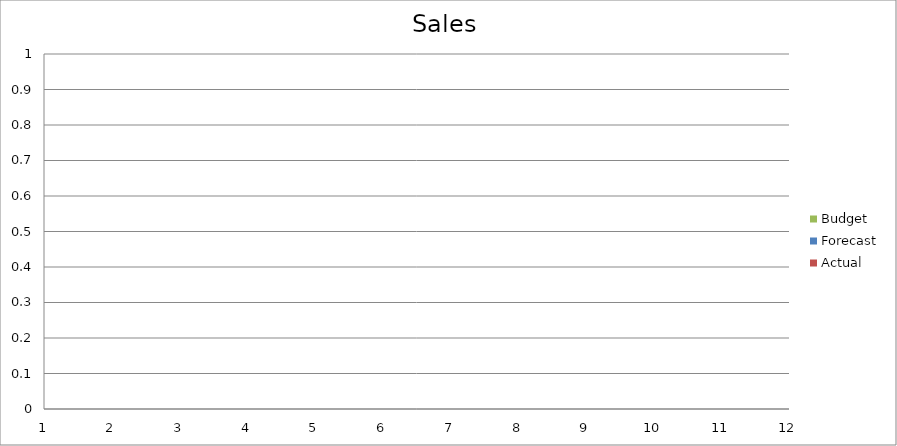
| Category | Budget | Forecast | Actual |
|---|---|---|---|
| 0 | 1090 | 2050 | 1720 |
| 1 | 900 | 2210 | 2680 |
| 2 | 3490 | 3500 | 2450 |
| 3 | 2830 | 3070 | 660 |
| 4 | 840 | 1420 | 1500 |
| 5 | 3250 | 1320 | 2030 |
| 6 | 3320 | 2840 | 2050 |
| 7 | 630 | 2080 | 1960 |
| 8 | 800 | 540 | 930 |
| 9 | 2690 | 1140 | 1420 |
| 10 | 3100 | 3140 | 2890 |
| 11 | 2170 | 2170 | 3300 |